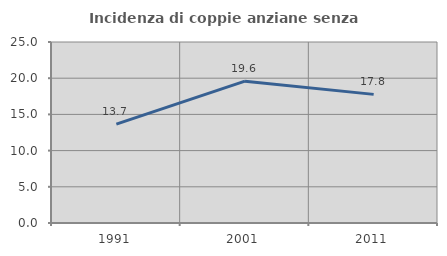
| Category | Incidenza di coppie anziane senza figli  |
|---|---|
| 1991.0 | 13.661 |
| 2001.0 | 19.591 |
| 2011.0 | 17.766 |